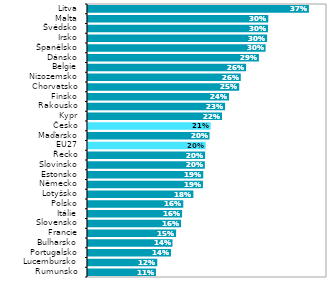
| Category | Series 1 |
|---|---|
| Rumunsko | 0.114 |
| Lucembursko | 0.116 |
| Portugalsko | 0.139 |
| Bulharsko | 0.141 |
| Francie | 0.147 |
| Slovensko | 0.156 |
| Itálie | 0.157 |
| Polsko | 0.159 |
| Lotyšsko | 0.176 |
| Německo | 0.192 |
| Estonsko | 0.193 |
| Slovinsko | 0.196 |
| Řecko | 0.196 |
| EU27 | 0.197 |
| Maďarsko | 0.203 |
| Česko | 0.205 |
| Kypr | 0.224 |
| Rakousko | 0.229 |
| Finsko | 0.236 |
| Chorvatsko | 0.253 |
| Nizozemsko | 0.256 |
| Belgie | 0.265 |
| Dánsko | 0.286 |
| Španělsko | 0.297 |
| Irsko | 0.3 |
| Švédsko | 0.301 |
| Malta | 0.302 |
| Litva | 0.37 |